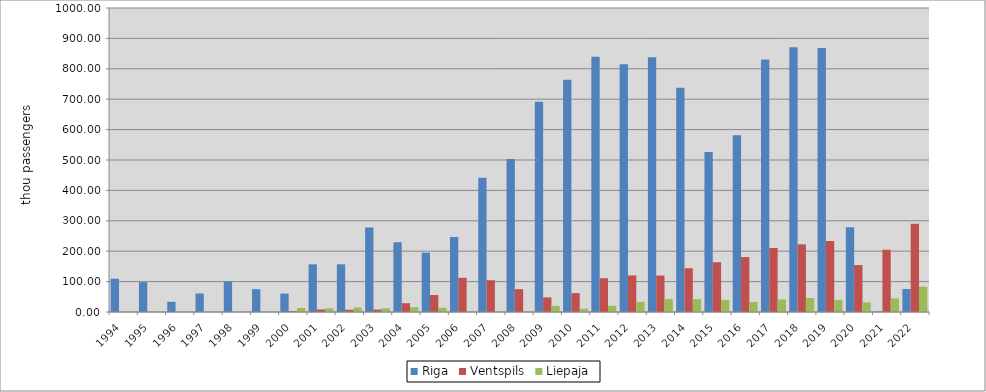
| Category | Riga | Ventspils | Liepaja |
|---|---|---|---|
| 1994.0 | 109.57 | 0 | 0 |
| 1995.0 | 98.19 | 0 | 0 |
| 1996.0 | 33.55 | 0 | 0 |
| 1997.0 | 60.88 | 0 | 0 |
| 1998.0 | 100.833 | 0 | 0 |
| 1999.0 | 75.147 | 0 | 0 |
| 2000.0 | 60.586 | 2.681 | 13.311 |
| 2001.0 | 156.77 | 8.37 | 12.356 |
| 2002.0 | 156.77 | 7.404 | 14.786 |
| 2003.0 | 278.028 | 8.032 | 12.162 |
| 2004.0 | 229.474 | 28.887 | 15.53 |
| 2005.0 | 195.195 | 55.788 | 13.812 |
| 2006.0 | 246.885 | 112.46 | 0.153 |
| 2007.0 | 441.914 | 104.422 | 0.116 |
| 2008.0 | 503.594 | 75.174 | 2.115 |
| 2009.0 | 691.236 | 48.012 | 20.041 |
| 2010.0 | 764.001 | 62.109 | 10.674 |
| 2011.0 | 839.712 | 111.019 | 20.432 |
| 2012.0 | 815.026 | 120.344 | 33.361 |
| 2013.0 | 837.665 | 120.014 | 42.607 |
| 2014.0 | 737.865 | 143.891 | 42.203 |
| 2015.0 | 526.243 | 163.666 | 39.782 |
| 2016.0 | 581.577 | 180.632 | 32.992 |
| 2017.0 | 830.38 | 210.532 | 41.111 |
| 2018.0 | 870.825 | 222.562 | 46.113 |
| 2019.0 | 868.656 | 233.537 | 39.987 |
| 2020.0 | 278.759 | 154.347 | 31.731 |
| 2021.0 | 2.005 | 204.843 | 44.612 |
| 2022.0 | 75.73 | 290.457 | 83.323 |